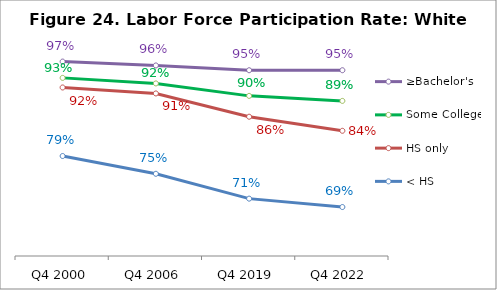
| Category | ≥Bachelor's | Some College | HS only | < HS |
|---|---|---|---|---|
| Q4 2000 | 0.965 | 0.935 | 0.916 | 0.788 |
| Q4 2006 | 0.958 | 0.924 | 0.905 | 0.754 |
| Q4 2019 | 0.949 | 0.901 | 0.862 | 0.708 |
| Q4 2022 | 0.949 | 0.891 | 0.835 | 0.692 |